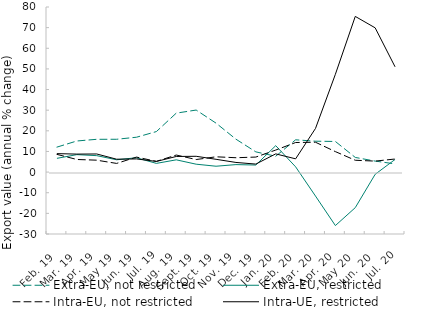
| Category | Extra-EU, not restricted | Extra-EU, restricted | Intra-EU, not restricted | Intra-UE, restricted |
|---|---|---|---|---|
| Feb. 19 | 12.104 | 6.668 | 8.581 | 8.941 |
| Mar. 19 | 15.07 | 8.463 | 6.111 | 8.716 |
| Apr. 19 | 15.888 | 7.97 | 5.773 | 8.774 |
| May 19 | 15.906 | 5.972 | 4.202 | 6.245 |
| Jun. 19 | 16.894 | 6.948 | 7.274 | 6.379 |
| Jul. 19 | 19.635 | 4.217 | 5.2 | 5.165 |
| Aug. 19 | 28.574 | 5.936 | 8.265 | 7.565 |
| Sept. 19 | 30.06 | 3.823 | 6.086 | 7.654 |
| Oct. 19 | 23.716 | 2.841 | 7.41 | 6.195 |
| Nov. 19 | 15.945 | 3.632 | 6.959 | 4.671 |
| Dec. 19 | 9.797 | 3.42 | 7.281 | 3.881 |
| Jan. 20 | 7.69 | 12.804 | 10.679 | 8.821 |
| Feb. 20 | 15.645 | 2.543 | 14.326 | 6.427 |
| Mar. 20 | 14.969 | -11.618 | 14.467 | 21.154 |
| Apr. 20 | 14.837 | -25.914 | 9.917 | 47.396 |
| May 20 | 7.102 | -17.231 | 5.736 | 75.436 |
| Jun. 20 | 5.33 | -1.072 | 5.317 | 69.902 |
| Jul. 20 | 3.98 | 6.12 | 6.338 | 51.022 |